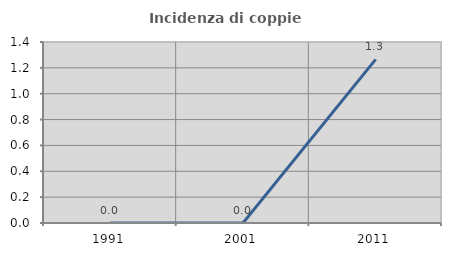
| Category | Incidenza di coppie miste |
|---|---|
| 1991.0 | 0 |
| 2001.0 | 0 |
| 2011.0 | 1.266 |